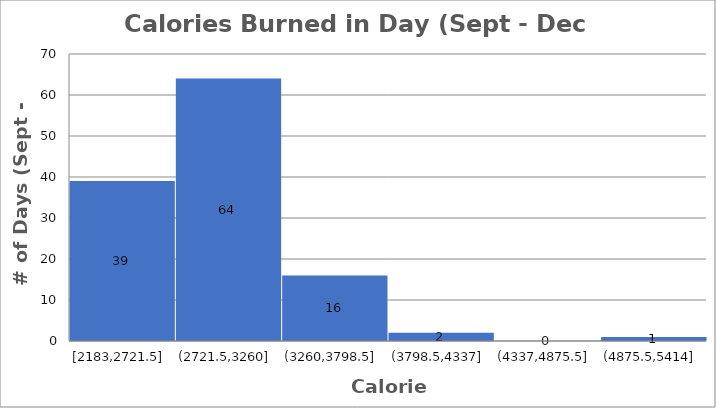
| Category | Series 0 |
|---|---|
| 0 | 77 |
| 1/1/00 | 119 |
| 1/2/00 | 22 |
| 1/3/00 | 59 |
| 1/4/00 | 55 |
| 1/5/00 | 95 |
| 1/6/00 | 80 |
| 1/7/00 | 120 |
| 1/8/00 | 65 |
| 1/9/00 | 74 |
| 1/10/00 | 50 |
| 1/11/00 | 67 |
| 1/12/00 | 78 |
| 1/13/00 | 64 |
| 1/14/00 | 75 |
| 1/15/00 | 76 |
| 1/16/00 | 0 |
| 1/17/00 | 79 |
| 1/18/00 | 43 |
| 1/19/00 | 71 |
| 1/20/00 | 125 |
| 1/21/00 | 107 |
| 1/22/00 | 70 |
| 1/23/00 | 68 |
| 1/24/00 | 58 |
| 1/25/00 | 54 |
| 1/26/00 | 69 |
| 1/27/00 | 97 |
| 1/28/00 | 106 |
| 1/29/00 | 83 |
| 1/30/00 | 25 |
| 1/31/00 | 62 |
| 2/1/00 | 68 |
| 2/2/00 | 103 |
| 2/3/00 | 48 |
| 2/4/00 | 94 |
| 2/5/00 | 71 |
| 2/6/00 | 95 |
| 2/7/00 | 118 |
| 2/8/00 | 68 |
| 2/9/00 | 41 |
| 2/10/00 | 90 |
| 2/11/00 | 26 |
| 2/12/00 | 47 |
| 2/13/00 | 94 |
| 2/14/00 | 84 |
| 2/15/00 | 59 |
| 2/16/00 | 81 |
| 2/17/00 | 79 |
| 2/18/00 | 75 |
| 2/19/00 | 67 |
| 2/20/00 | 61 |
| 2/21/00 | 52 |
| 2/22/00 | 85 |
| 2/23/00 | 85 |
| 2/24/00 | 118 |
| 2/25/00 | 110 |
| 2/26/00 | 51 |
| 2/27/00 | 69 |
| 2/28/00 | 59 |
| 2/28/00 | 63 |
| 3/1/00 | 64 |
| 3/2/00 | 94 |
| 3/3/00 | 95 |
| 3/4/00 | 67 |
| 3/5/00 | 84 |
| 3/6/00 | 68 |
| 3/7/00 | 101 |
| 3/8/00 | 68 |
| 3/9/00 | 116 |
| 3/10/00 | 99 |
| 3/11/00 | 85 |
| 3/12/00 | 59 |
| 3/13/00 | 44 |
| 3/14/00 | 76 |
| 3/15/00 | 92 |
| 3/16/00 | 93 |
| 3/17/00 | 75 |
| 3/18/00 | 56 |
| 3/19/00 | 86 |
| 3/20/00 | 51 |
| 3/21/00 | 65 |
| 3/22/00 | 45 |
| 3/23/00 | 84 |
| 3/24/00 | 147 |
| 3/25/00 | 87 |
| 3/26/00 | 51 |
| 3/27/00 | 40 |
| 3/28/00 | 138 |
| 3/29/00 | 103 |
| 3/30/00 | 91 |
| 3/31/00 | 77 |
| 4/1/00 | 63 |
| 4/2/00 | 48 |
| 4/3/00 | 42 |
| 4/4/00 | 66 |
| 4/5/00 | 98 |
| 4/6/00 | 95 |
| 4/7/00 | 109 |
| 4/8/00 | 62 |
| 4/9/00 | 69 |
| 4/10/00 | 67 |
| 4/11/00 | 94 |
| 4/12/00 | 52 |
| 4/13/00 | 83 |
| 4/14/00 | 82 |
| 4/15/00 | 58 |
| 4/16/00 | 73 |
| 4/17/00 | 32 |
| 4/18/00 | 56 |
| 4/19/00 | 73 |
| 4/20/00 | 50 |
| 4/21/00 | 104 |
| 4/22/00 | 69 |
| 4/23/00 | 84 |
| 4/24/00 | 83 |
| 4/25/00 | 86 |
| 4/26/00 | 105 |
| 4/27/00 | 91 |
| 4/28/00 | 57 |
| 4/29/00 | 87 |
| 4/30/00 | 33 |